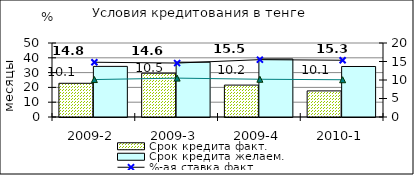
| Category | Срок кредита факт.  | Срок кредита желаем. |
|---|---|---|
| 2009-2 | 22.78 | 34.2 |
| 2009-3 | 29.58 | 37.04 |
| 2009-4 | 21.55 | 39.22 |
| 2010-1 | 17.64 | 34.13 |